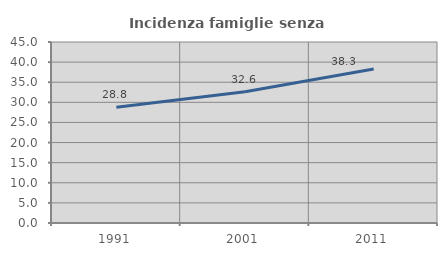
| Category | Incidenza famiglie senza nuclei |
|---|---|
| 1991.0 | 28.799 |
| 2001.0 | 32.642 |
| 2011.0 | 38.309 |